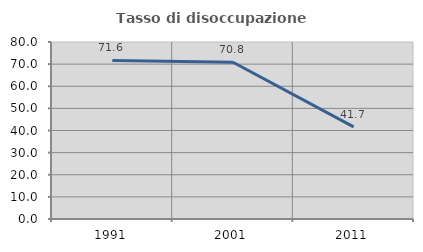
| Category | Tasso di disoccupazione giovanile  |
|---|---|
| 1991.0 | 71.642 |
| 2001.0 | 70.833 |
| 2011.0 | 41.667 |